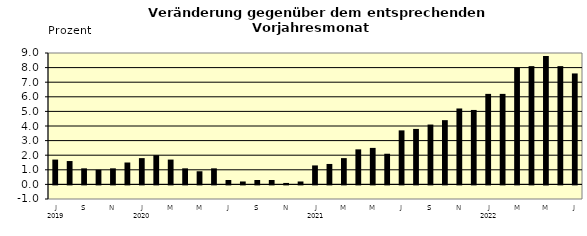
| Category | Series 0 |
|---|---|
| 0 | 1.7 |
| 1 | 1.6 |
| 2 | 1.1 |
| 3 | 1 |
| 4 | 1.1 |
| 5 | 1.5 |
| 6 | 1.8 |
| 7 | 2 |
| 8 | 1.7 |
| 9 | 1.1 |
| 10 | 0.9 |
| 11 | 1.1 |
| 12 | 0.3 |
| 13 | 0.2 |
| 14 | 0.3 |
| 15 | 0.3 |
| 16 | 0.1 |
| 17 | 0.2 |
| 18 | 1.3 |
| 19 | 1.4 |
| 20 | 1.8 |
| 21 | 2.4 |
| 22 | 2.5 |
| 23 | 2.1 |
| 24 | 3.7 |
| 25 | 3.8 |
| 26 | 4.1 |
| 27 | 4.4 |
| 28 | 5.2 |
| 29 | 5.1 |
| 30 | 6.2 |
| 31 | 6.2 |
| 32 | 8 |
| 33 | 8.1 |
| 34 | 8.8 |
| 35 | 8.1 |
| 36 | 7.6 |